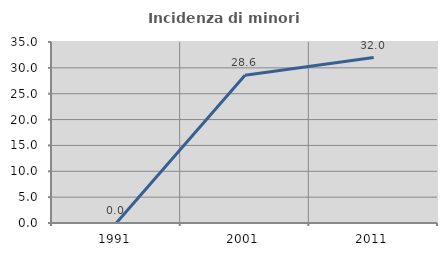
| Category | Incidenza di minori stranieri |
|---|---|
| 1991.0 | 0 |
| 2001.0 | 28.571 |
| 2011.0 | 32 |